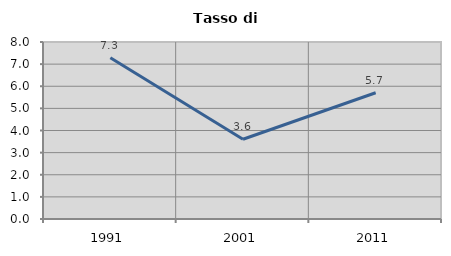
| Category | Tasso di disoccupazione   |
|---|---|
| 1991.0 | 7.291 |
| 2001.0 | 3.605 |
| 2011.0 | 5.707 |